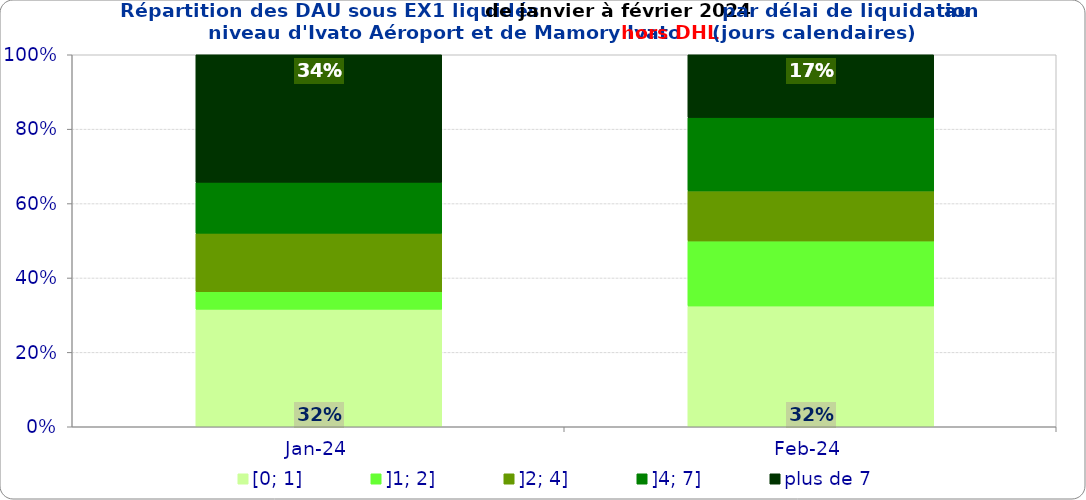
| Category | [0; 1] | ]1; 2] | ]2; 4] | ]4; 7] | plus de 7 |
|---|---|---|---|---|---|
| 2024-01-01 | 0.316 | 0.047 | 0.157 | 0.137 | 0.343 |
| 2024-02-01 | 0.325 | 0.175 | 0.135 | 0.197 | 0.169 |